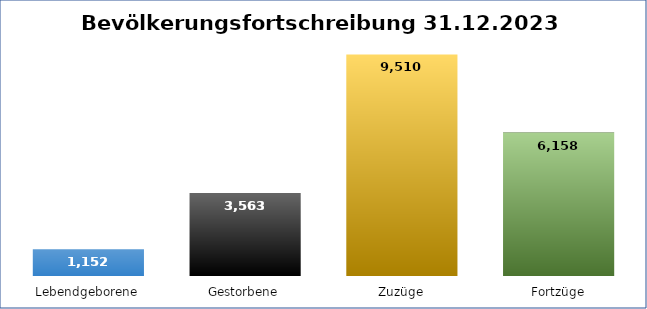
| Category | Series 0 |
|---|---|
| Lebendgeborene | 1152 |
| Gestorbene | 3563 |
| Zuzüge | 9510 |
| Fortzüge | 6158 |